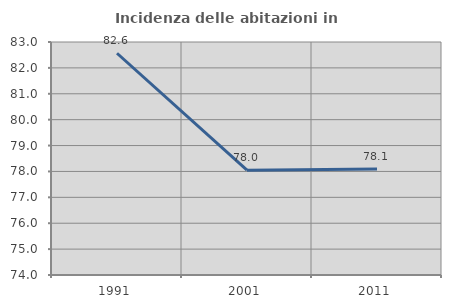
| Category | Incidenza delle abitazioni in proprietà  |
|---|---|
| 1991.0 | 82.565 |
| 2001.0 | 78.049 |
| 2011.0 | 78.097 |